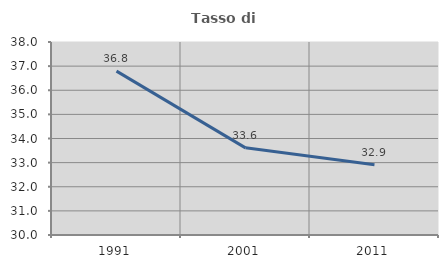
| Category | Tasso di occupazione   |
|---|---|
| 1991.0 | 36.793 |
| 2001.0 | 33.612 |
| 2011.0 | 32.91 |